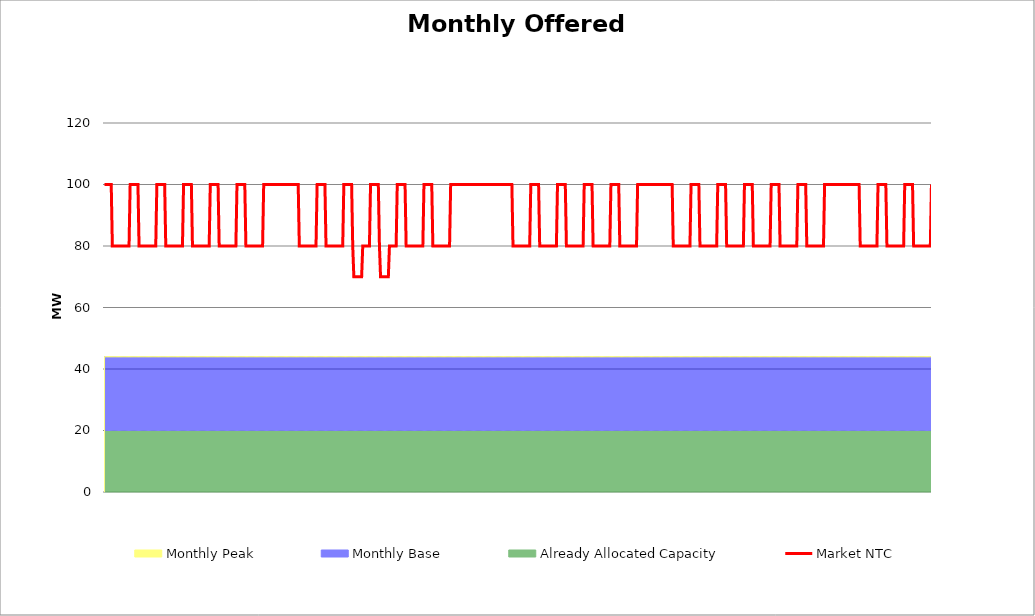
| Category | Market NTC |
|---|---|
| 0 | 100 |
| 1 | 100 |
| 2 | 100 |
| 3 | 100 |
| 4 | 100 |
| 5 | 100 |
| 6 | 100 |
| 7 | 80 |
| 8 | 80 |
| 9 | 80 |
| 10 | 80 |
| 11 | 80 |
| 12 | 80 |
| 13 | 80 |
| 14 | 80 |
| 15 | 80 |
| 16 | 80 |
| 17 | 80 |
| 18 | 80 |
| 19 | 80 |
| 20 | 80 |
| 21 | 80 |
| 22 | 80 |
| 23 | 100 |
| 24 | 100 |
| 25 | 100 |
| 26 | 100 |
| 27 | 100 |
| 28 | 100 |
| 29 | 100 |
| 30 | 100 |
| 31 | 80 |
| 32 | 80 |
| 33 | 80 |
| 34 | 80 |
| 35 | 80 |
| 36 | 80 |
| 37 | 80 |
| 38 | 80 |
| 39 | 80 |
| 40 | 80 |
| 41 | 80 |
| 42 | 80 |
| 43 | 80 |
| 44 | 80 |
| 45 | 80 |
| 46 | 80 |
| 47 | 100 |
| 48 | 100 |
| 49 | 100 |
| 50 | 100 |
| 51 | 100 |
| 52 | 100 |
| 53 | 100 |
| 54 | 100 |
| 55 | 80 |
| 56 | 80 |
| 57 | 80 |
| 58 | 80 |
| 59 | 80 |
| 60 | 80 |
| 61 | 80 |
| 62 | 80 |
| 63 | 80 |
| 64 | 80 |
| 65 | 80 |
| 66 | 80 |
| 67 | 80 |
| 68 | 80 |
| 69 | 80 |
| 70 | 80 |
| 71 | 100 |
| 72 | 100 |
| 73 | 100 |
| 74 | 100 |
| 75 | 100 |
| 76 | 100 |
| 77 | 100 |
| 78 | 100 |
| 79 | 80 |
| 80 | 80 |
| 81 | 80 |
| 82 | 80 |
| 83 | 80 |
| 84 | 80 |
| 85 | 80 |
| 86 | 80 |
| 87 | 80 |
| 88 | 80 |
| 89 | 80 |
| 90 | 80 |
| 91 | 80 |
| 92 | 80 |
| 93 | 80 |
| 94 | 80 |
| 95 | 100 |
| 96 | 100 |
| 97 | 100 |
| 98 | 100 |
| 99 | 100 |
| 100 | 100 |
| 101 | 100 |
| 102 | 100 |
| 103 | 80 |
| 104 | 80 |
| 105 | 80 |
| 106 | 80 |
| 107 | 80 |
| 108 | 80 |
| 109 | 80 |
| 110 | 80 |
| 111 | 80 |
| 112 | 80 |
| 113 | 80 |
| 114 | 80 |
| 115 | 80 |
| 116 | 80 |
| 117 | 80 |
| 118 | 80 |
| 119 | 100 |
| 120 | 100 |
| 121 | 100 |
| 122 | 100 |
| 123 | 100 |
| 124 | 100 |
| 125 | 100 |
| 126 | 100 |
| 127 | 80 |
| 128 | 80 |
| 129 | 80 |
| 130 | 80 |
| 131 | 80 |
| 132 | 80 |
| 133 | 80 |
| 134 | 80 |
| 135 | 80 |
| 136 | 80 |
| 137 | 80 |
| 138 | 80 |
| 139 | 80 |
| 140 | 80 |
| 141 | 80 |
| 142 | 80 |
| 143 | 100 |
| 144 | 100 |
| 145 | 100 |
| 146 | 100 |
| 147 | 100 |
| 148 | 100 |
| 149 | 100 |
| 150 | 100 |
| 151 | 100 |
| 152 | 100 |
| 153 | 100 |
| 154 | 100 |
| 155 | 100 |
| 156 | 100 |
| 157 | 100 |
| 158 | 100 |
| 159 | 100 |
| 160 | 100 |
| 161 | 100 |
| 162 | 100 |
| 163 | 100 |
| 164 | 100 |
| 165 | 100 |
| 166 | 100 |
| 167 | 100 |
| 168 | 100 |
| 169 | 100 |
| 170 | 100 |
| 171 | 100 |
| 172 | 100 |
| 173 | 100 |
| 174 | 100 |
| 175 | 80 |
| 176 | 80 |
| 177 | 80 |
| 178 | 80 |
| 179 | 80 |
| 180 | 80 |
| 181 | 80 |
| 182 | 80 |
| 183 | 80 |
| 184 | 80 |
| 185 | 80 |
| 186 | 80 |
| 187 | 80 |
| 188 | 80 |
| 189 | 80 |
| 190 | 80 |
| 191 | 100 |
| 192 | 100 |
| 193 | 100 |
| 194 | 100 |
| 195 | 100 |
| 196 | 100 |
| 197 | 100 |
| 198 | 100 |
| 199 | 80 |
| 200 | 80 |
| 201 | 80 |
| 202 | 80 |
| 203 | 80 |
| 204 | 80 |
| 205 | 80 |
| 206 | 80 |
| 207 | 80 |
| 208 | 80 |
| 209 | 80 |
| 210 | 80 |
| 211 | 80 |
| 212 | 80 |
| 213 | 80 |
| 214 | 80 |
| 215 | 100 |
| 216 | 100 |
| 217 | 100 |
| 218 | 100 |
| 219 | 100 |
| 220 | 100 |
| 221 | 100 |
| 222 | 100 |
| 223 | 80 |
| 224 | 70 |
| 225 | 70 |
| 226 | 70 |
| 227 | 70 |
| 228 | 70 |
| 229 | 70 |
| 230 | 70 |
| 231 | 70 |
| 232 | 80 |
| 233 | 80 |
| 234 | 80 |
| 235 | 80 |
| 236 | 80 |
| 237 | 80 |
| 238 | 80 |
| 239 | 100 |
| 240 | 100 |
| 241 | 100 |
| 242 | 100 |
| 243 | 100 |
| 244 | 100 |
| 245 | 100 |
| 246 | 100 |
| 247 | 80 |
| 248 | 70 |
| 249 | 70 |
| 250 | 70 |
| 251 | 70 |
| 252 | 70 |
| 253 | 70 |
| 254 | 70 |
| 255 | 70 |
| 256 | 80 |
| 257 | 80 |
| 258 | 80 |
| 259 | 80 |
| 260 | 80 |
| 261 | 80 |
| 262 | 80 |
| 263 | 100 |
| 264 | 100 |
| 265 | 100 |
| 266 | 100 |
| 267 | 100 |
| 268 | 100 |
| 269 | 100 |
| 270 | 100 |
| 271 | 80 |
| 272 | 80 |
| 273 | 80 |
| 274 | 80 |
| 275 | 80 |
| 276 | 80 |
| 277 | 80 |
| 278 | 80 |
| 279 | 80 |
| 280 | 80 |
| 281 | 80 |
| 282 | 80 |
| 283 | 80 |
| 284 | 80 |
| 285 | 80 |
| 286 | 80 |
| 287 | 100 |
| 288 | 100 |
| 289 | 100 |
| 290 | 100 |
| 291 | 100 |
| 292 | 100 |
| 293 | 100 |
| 294 | 100 |
| 295 | 80 |
| 296 | 80 |
| 297 | 80 |
| 298 | 80 |
| 299 | 80 |
| 300 | 80 |
| 301 | 80 |
| 302 | 80 |
| 303 | 80 |
| 304 | 80 |
| 305 | 80 |
| 306 | 80 |
| 307 | 80 |
| 308 | 80 |
| 309 | 80 |
| 310 | 80 |
| 311 | 100 |
| 312 | 100 |
| 313 | 100 |
| 314 | 100 |
| 315 | 100 |
| 316 | 100 |
| 317 | 100 |
| 318 | 100 |
| 319 | 100 |
| 320 | 100 |
| 321 | 100 |
| 322 | 100 |
| 323 | 100 |
| 324 | 100 |
| 325 | 100 |
| 326 | 100 |
| 327 | 100 |
| 328 | 100 |
| 329 | 100 |
| 330 | 100 |
| 331 | 100 |
| 332 | 100 |
| 333 | 100 |
| 334 | 100 |
| 335 | 100 |
| 336 | 100 |
| 337 | 100 |
| 338 | 100 |
| 339 | 100 |
| 340 | 100 |
| 341 | 100 |
| 342 | 100 |
| 343 | 100 |
| 344 | 100 |
| 345 | 100 |
| 346 | 100 |
| 347 | 100 |
| 348 | 100 |
| 349 | 100 |
| 350 | 100 |
| 351 | 100 |
| 352 | 100 |
| 353 | 100 |
| 354 | 100 |
| 355 | 100 |
| 356 | 100 |
| 357 | 100 |
| 358 | 100 |
| 359 | 100 |
| 360 | 100 |
| 361 | 100 |
| 362 | 100 |
| 363 | 100 |
| 364 | 100 |
| 365 | 100 |
| 366 | 100 |
| 367 | 80 |
| 368 | 80 |
| 369 | 80 |
| 370 | 80 |
| 371 | 80 |
| 372 | 80 |
| 373 | 80 |
| 374 | 80 |
| 375 | 80 |
| 376 | 80 |
| 377 | 80 |
| 378 | 80 |
| 379 | 80 |
| 380 | 80 |
| 381 | 80 |
| 382 | 80 |
| 383 | 100 |
| 384 | 100 |
| 385 | 100 |
| 386 | 100 |
| 387 | 100 |
| 388 | 100 |
| 389 | 100 |
| 390 | 100 |
| 391 | 80 |
| 392 | 80 |
| 393 | 80 |
| 394 | 80 |
| 395 | 80 |
| 396 | 80 |
| 397 | 80 |
| 398 | 80 |
| 399 | 80 |
| 400 | 80 |
| 401 | 80 |
| 402 | 80 |
| 403 | 80 |
| 404 | 80 |
| 405 | 80 |
| 406 | 80 |
| 407 | 100 |
| 408 | 100 |
| 409 | 100 |
| 410 | 100 |
| 411 | 100 |
| 412 | 100 |
| 413 | 100 |
| 414 | 100 |
| 415 | 80 |
| 416 | 80 |
| 417 | 80 |
| 418 | 80 |
| 419 | 80 |
| 420 | 80 |
| 421 | 80 |
| 422 | 80 |
| 423 | 80 |
| 424 | 80 |
| 425 | 80 |
| 426 | 80 |
| 427 | 80 |
| 428 | 80 |
| 429 | 80 |
| 430 | 80 |
| 431 | 100 |
| 432 | 100 |
| 433 | 100 |
| 434 | 100 |
| 435 | 100 |
| 436 | 100 |
| 437 | 100 |
| 438 | 100 |
| 439 | 80 |
| 440 | 80 |
| 441 | 80 |
| 442 | 80 |
| 443 | 80 |
| 444 | 80 |
| 445 | 80 |
| 446 | 80 |
| 447 | 80 |
| 448 | 80 |
| 449 | 80 |
| 450 | 80 |
| 451 | 80 |
| 452 | 80 |
| 453 | 80 |
| 454 | 80 |
| 455 | 100 |
| 456 | 100 |
| 457 | 100 |
| 458 | 100 |
| 459 | 100 |
| 460 | 100 |
| 461 | 100 |
| 462 | 100 |
| 463 | 80 |
| 464 | 80 |
| 465 | 80 |
| 466 | 80 |
| 467 | 80 |
| 468 | 80 |
| 469 | 80 |
| 470 | 80 |
| 471 | 80 |
| 472 | 80 |
| 473 | 80 |
| 474 | 80 |
| 475 | 80 |
| 476 | 80 |
| 477 | 80 |
| 478 | 80 |
| 479 | 100 |
| 480 | 100 |
| 481 | 100 |
| 482 | 100 |
| 483 | 100 |
| 484 | 100 |
| 485 | 100 |
| 486 | 100 |
| 487 | 100 |
| 488 | 100 |
| 489 | 100 |
| 490 | 100 |
| 491 | 100 |
| 492 | 100 |
| 493 | 100 |
| 494 | 100 |
| 495 | 100 |
| 496 | 100 |
| 497 | 100 |
| 498 | 100 |
| 499 | 100 |
| 500 | 100 |
| 501 | 100 |
| 502 | 100 |
| 503 | 100 |
| 504 | 100 |
| 505 | 100 |
| 506 | 100 |
| 507 | 100 |
| 508 | 100 |
| 509 | 100 |
| 510 | 100 |
| 511 | 80 |
| 512 | 80 |
| 513 | 80 |
| 514 | 80 |
| 515 | 80 |
| 516 | 80 |
| 517 | 80 |
| 518 | 80 |
| 519 | 80 |
| 520 | 80 |
| 521 | 80 |
| 522 | 80 |
| 523 | 80 |
| 524 | 80 |
| 525 | 80 |
| 526 | 80 |
| 527 | 100 |
| 528 | 100 |
| 529 | 100 |
| 530 | 100 |
| 531 | 100 |
| 532 | 100 |
| 533 | 100 |
| 534 | 100 |
| 535 | 80 |
| 536 | 80 |
| 537 | 80 |
| 538 | 80 |
| 539 | 80 |
| 540 | 80 |
| 541 | 80 |
| 542 | 80 |
| 543 | 80 |
| 544 | 80 |
| 545 | 80 |
| 546 | 80 |
| 547 | 80 |
| 548 | 80 |
| 549 | 80 |
| 550 | 80 |
| 551 | 100 |
| 552 | 100 |
| 553 | 100 |
| 554 | 100 |
| 555 | 100 |
| 556 | 100 |
| 557 | 100 |
| 558 | 100 |
| 559 | 80 |
| 560 | 80 |
| 561 | 80 |
| 562 | 80 |
| 563 | 80 |
| 564 | 80 |
| 565 | 80 |
| 566 | 80 |
| 567 | 80 |
| 568 | 80 |
| 569 | 80 |
| 570 | 80 |
| 571 | 80 |
| 572 | 80 |
| 573 | 80 |
| 574 | 80 |
| 575 | 100 |
| 576 | 100 |
| 577 | 100 |
| 578 | 100 |
| 579 | 100 |
| 580 | 100 |
| 581 | 100 |
| 582 | 100 |
| 583 | 80 |
| 584 | 80 |
| 585 | 80 |
| 586 | 80 |
| 587 | 80 |
| 588 | 80 |
| 589 | 80 |
| 590 | 80 |
| 591 | 80 |
| 592 | 80 |
| 593 | 80 |
| 594 | 80 |
| 595 | 80 |
| 596 | 80 |
| 597 | 80 |
| 598 | 80 |
| 599 | 100 |
| 600 | 100 |
| 601 | 100 |
| 602 | 100 |
| 603 | 100 |
| 604 | 100 |
| 605 | 100 |
| 606 | 100 |
| 607 | 80 |
| 608 | 80 |
| 609 | 80 |
| 610 | 80 |
| 611 | 80 |
| 612 | 80 |
| 613 | 80 |
| 614 | 80 |
| 615 | 80 |
| 616 | 80 |
| 617 | 80 |
| 618 | 80 |
| 619 | 80 |
| 620 | 80 |
| 621 | 80 |
| 622 | 80 |
| 623 | 100 |
| 624 | 100 |
| 625 | 100 |
| 626 | 100 |
| 627 | 100 |
| 628 | 100 |
| 629 | 100 |
| 630 | 100 |
| 631 | 80 |
| 632 | 80 |
| 633 | 80 |
| 634 | 80 |
| 635 | 80 |
| 636 | 80 |
| 637 | 80 |
| 638 | 80 |
| 639 | 80 |
| 640 | 80 |
| 641 | 80 |
| 642 | 80 |
| 643 | 80 |
| 644 | 80 |
| 645 | 80 |
| 646 | 80 |
| 647 | 100 |
| 648 | 100 |
| 649 | 100 |
| 650 | 100 |
| 651 | 100 |
| 652 | 100 |
| 653 | 100 |
| 654 | 100 |
| 655 | 100 |
| 656 | 100 |
| 657 | 100 |
| 658 | 100 |
| 659 | 100 |
| 660 | 100 |
| 661 | 100 |
| 662 | 100 |
| 663 | 100 |
| 664 | 100 |
| 665 | 100 |
| 666 | 100 |
| 667 | 100 |
| 668 | 100 |
| 669 | 100 |
| 670 | 100 |
| 671 | 100 |
| 672 | 100 |
| 673 | 100 |
| 674 | 100 |
| 675 | 100 |
| 676 | 100 |
| 677 | 100 |
| 678 | 100 |
| 679 | 80 |
| 680 | 80 |
| 681 | 80 |
| 682 | 80 |
| 683 | 80 |
| 684 | 80 |
| 685 | 80 |
| 686 | 80 |
| 687 | 80 |
| 688 | 80 |
| 689 | 80 |
| 690 | 80 |
| 691 | 80 |
| 692 | 80 |
| 693 | 80 |
| 694 | 80 |
| 695 | 100 |
| 696 | 100 |
| 697 | 100 |
| 698 | 100 |
| 699 | 100 |
| 700 | 100 |
| 701 | 100 |
| 702 | 100 |
| 703 | 80 |
| 704 | 80 |
| 705 | 80 |
| 706 | 80 |
| 707 | 80 |
| 708 | 80 |
| 709 | 80 |
| 710 | 80 |
| 711 | 80 |
| 712 | 80 |
| 713 | 80 |
| 714 | 80 |
| 715 | 80 |
| 716 | 80 |
| 717 | 80 |
| 718 | 80 |
| 719 | 100 |
| 720 | 100 |
| 721 | 100 |
| 722 | 100 |
| 723 | 100 |
| 724 | 100 |
| 725 | 100 |
| 726 | 100 |
| 727 | 80 |
| 728 | 80 |
| 729 | 80 |
| 730 | 80 |
| 731 | 80 |
| 732 | 80 |
| 733 | 80 |
| 734 | 80 |
| 735 | 80 |
| 736 | 80 |
| 737 | 80 |
| 738 | 80 |
| 739 | 80 |
| 740 | 80 |
| 741 | 80 |
| 742 | 80 |
| 743 | 100 |